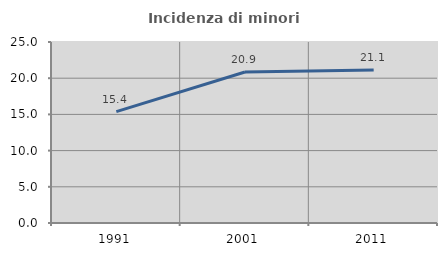
| Category | Incidenza di minori stranieri |
|---|---|
| 1991.0 | 15.385 |
| 2001.0 | 20.859 |
| 2011.0 | 21.135 |